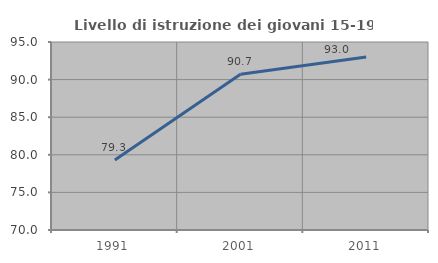
| Category | Livello di istruzione dei giovani 15-19 anni |
|---|---|
| 1991.0 | 79.304 |
| 2001.0 | 90.714 |
| 2011.0 | 93.011 |